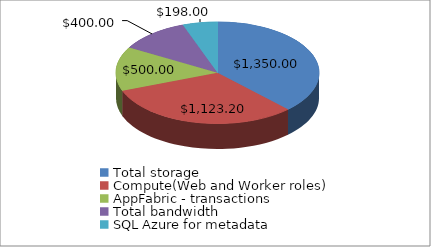
| Category | Series 0 |
|---|---|
| Total storage | 1350 |
| Compute(Web and Worker roles) | 1123.2 |
| AppFabric - transactions | 500 |
| Total bandwidth  | 400 |
| SQL Azure for metadata | 198 |